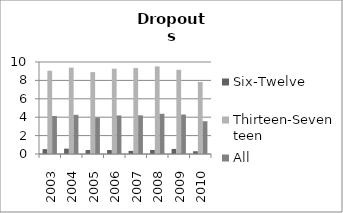
| Category | Six-Twelve | Thirteen-Seventeen | All |
|---|---|---|---|
| 2003.0 | 0.53 | 9.05 | 4.13 |
| 2004.0 | 0.58 | 9.39 | 4.26 |
| 2005.0 | 0.43 | 8.9 | 3.97 |
| 2006.0 | 0.43 | 9.27 | 4.19 |
| 2007.0 | 0.34 | 9.34 | 4.2 |
| 2008.0 | 0.44 | 9.52 | 4.37 |
| 2009.0 | 0.55 | 9.15 | 4.29 |
| 2010.0 | 0.3 | 7.83 | 3.56 |